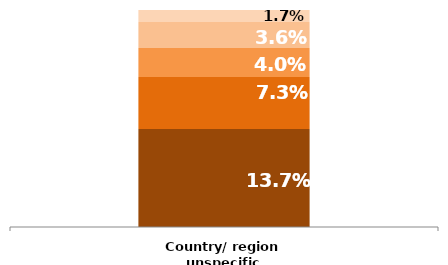
| Category | Series 1 | Series 0 | Series 2 | Series 4 | Series 3 | Series 5 |
|---|---|---|---|---|---|---|
| Country/ region unspecific | 0.137 | 0.073 | 0 | 0.04 | 0.036 | 0.017 |